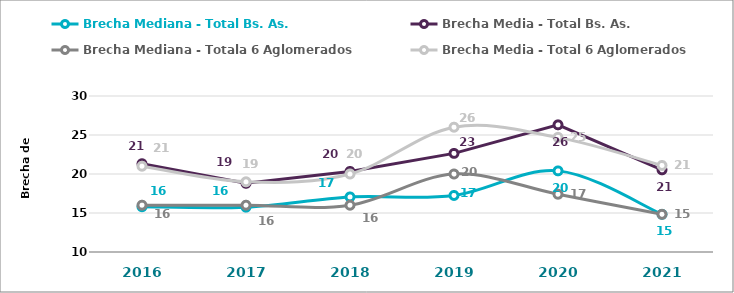
| Category | Brecha Mediana - Total Bs. As. | Brecha Media - Total Bs. As. | Brecha Mediana - Totala 6 Aglomerados | Brecha Media - Total 6 Aglomerados |
|---|---|---|---|---|
| 2016.0 | 15.803 | 21.314 | 16 | 21 |
| 2017.0 | 15.75 | 18.805 | 16 | 19 |
| 2018.0 | 17.059 | 20.33 | 16 | 20 |
| 2019.0 | 17.25 | 22.641 | 20 | 26 |
| 2020.0 | 20.4 | 26.303 | 17.406 | 24.699 |
| 2021.0 | 14.832 | 20.533 | 14.832 | 21.096 |